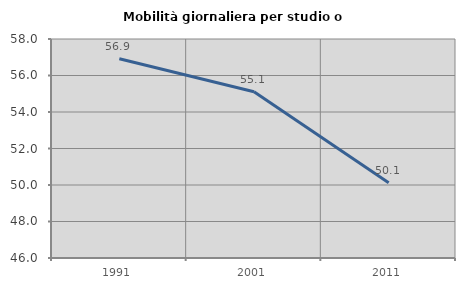
| Category | Mobilità giornaliera per studio o lavoro |
|---|---|
| 1991.0 | 56.92 |
| 2001.0 | 55.109 |
| 2011.0 | 50.129 |